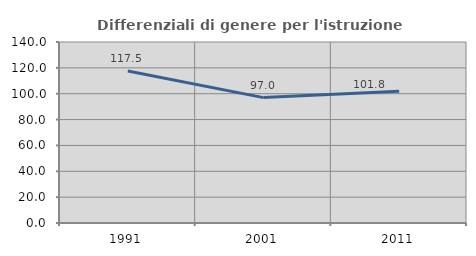
| Category | Differenziali di genere per l'istruzione superiore |
|---|---|
| 1991.0 | 117.496 |
| 2001.0 | 96.99 |
| 2011.0 | 101.818 |